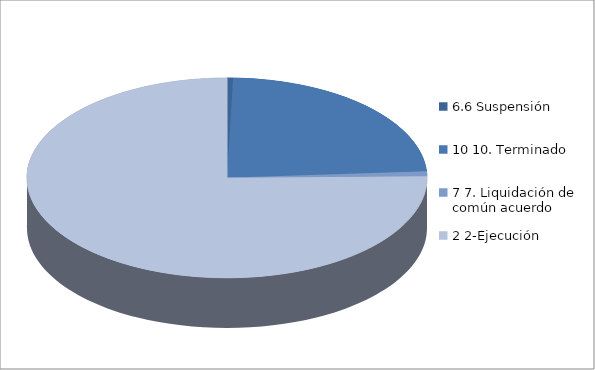
| Category | Series 0 |
|---|---|
| 6.6 Suspensión | 3 |
| 10 10. Terminado | 147 |
| 7 7. Liquidación de común acuerdo | 5 |
| 2 2-Ejecución | 471 |